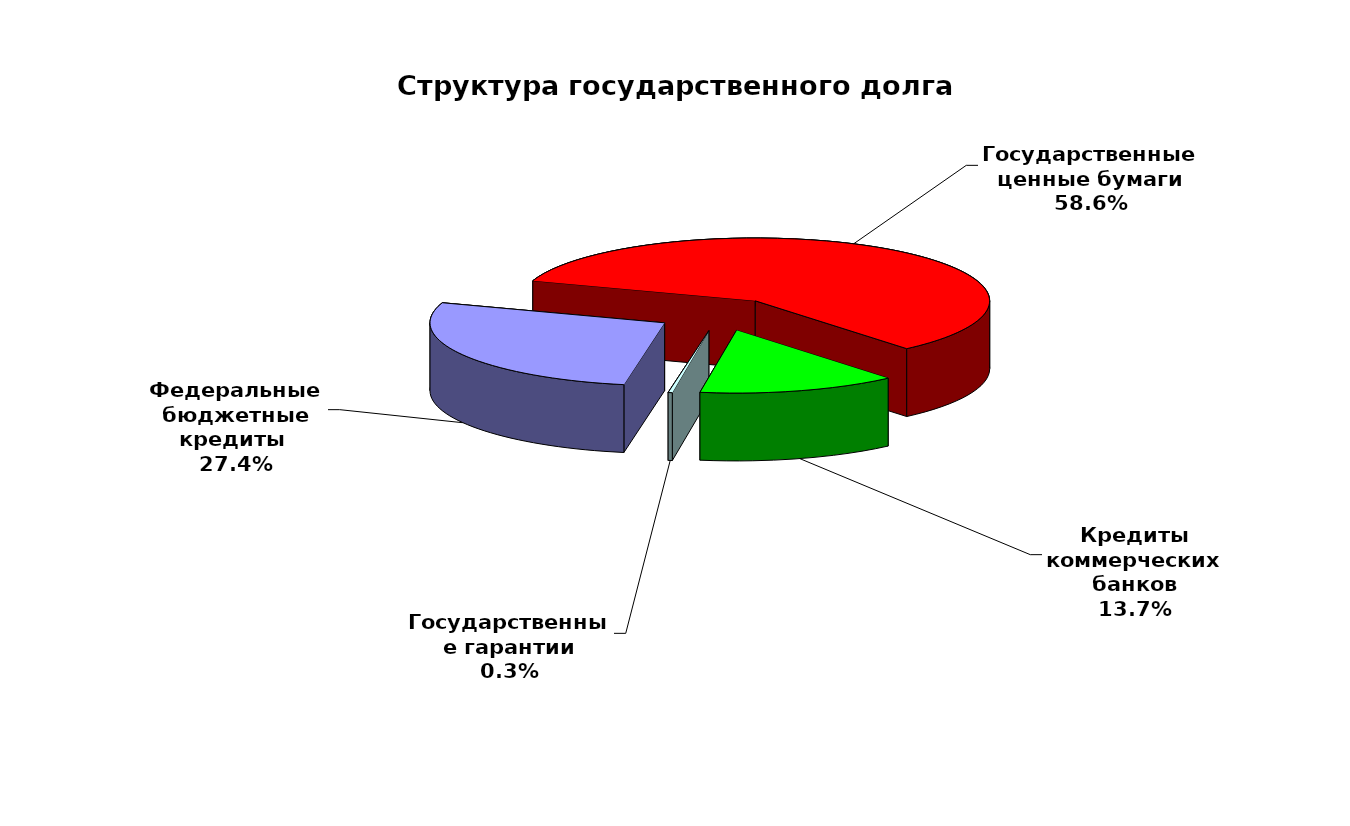
| Category | Series 0 |
|---|---|
| Федеральные бюджетные кредиты  | 19957026.213 |
| Государственные ценные бумаги | 42700000 |
| Кредиты коммерческих банков | 9957709.3 |
| Государственные гарантии | 209872.86 |